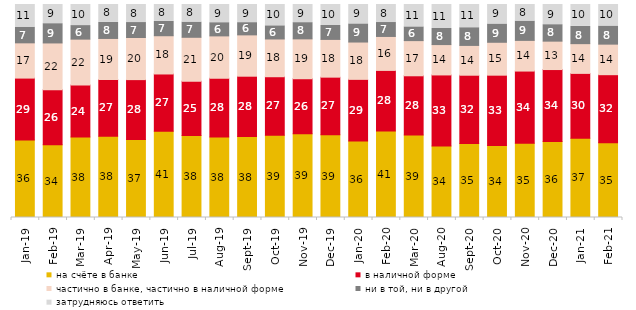
| Category | на счёте в банке | в наличной форме | частично в банке, частично в наличной форме | ни в той, ни в другой | затрудняюсь ответить |
|---|---|---|---|---|---|
| 2019-01-01 | 36.35 | 29.1 | 16.55 | 7.35 | 10.65 |
| 2019-02-01 | 34.2 | 25.75 | 22 | 9.05 | 9 |
| 2019-03-01 | 37.842 | 24.316 | 21.581 | 6.365 | 9.896 |
| 2019-04-01 | 38.119 | 26.634 | 19.307 | 7.574 | 8.366 |
| 2019-05-01 | 36.652 | 28.083 | 19.762 | 7.033 | 8.47 |
| 2019-06-01 | 40.549 | 26.833 | 17.955 | 6.733 | 7.93 |
| 2019-07-01 | 38.465 | 25.495 | 20.644 | 7.129 | 8.267 |
| 2019-08-01 | 37.812 | 27.522 | 19.93 | 6.194 | 8.541 |
| 2019-09-01 | 37.97 | 28.366 | 19.406 | 5.743 | 8.515 |
| 2019-10-01 | 38.663 | 27.426 | 17.723 | 6.188 | 10 |
| 2019-11-01 | 39.356 | 25.792 | 18.713 | 7.624 | 8.515 |
| 2019-12-01 | 38.812 | 27.079 | 17.723 | 6.535 | 9.851 |
| 2020-01-01 | 35.941 | 28.911 | 17.525 | 8.515 | 9.109 |
| 2020-02-01 | 40.644 | 28.416 | 15.941 | 6.535 | 8.465 |
| 2020-03-01 | 38.77 | 27.764 | 16.51 | 6.445 | 10.511 |
| 2020-08-01 | 33.565 | 33.366 | 14.25 | 7.547 | 11.271 |
| 2020-09-01 | 34.744 | 32.056 | 13.987 | 8.313 | 10.901 |
| 2020-10-01 | 33.832 | 32.985 | 15.446 | 8.57 | 9.168 |
| 2020-11-01 | 34.85 | 33.9 | 14.4 | 9.05 | 7.8 |
| 2020-12-01 | 35.647 | 33.813 | 13.337 | 7.734 | 9.47 |
| 2021-01-01 | 37.208 | 30.452 | 13.959 | 8.097 | 10.283 |
| 2021-02-01 | 35.037 | 32.01 | 14.342 | 8.486 | 10.124 |